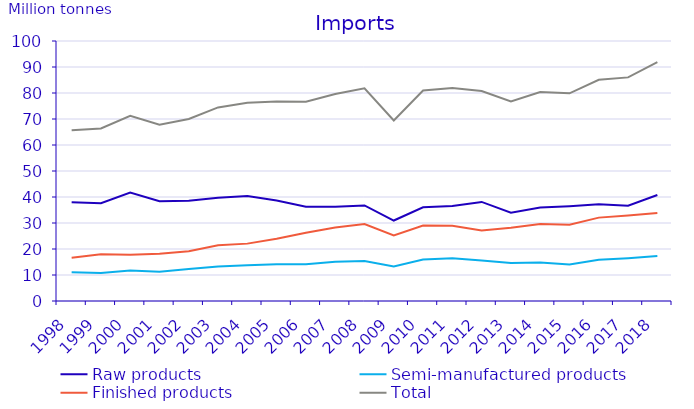
| Category | Raw products | Semi-manufactured products | Finished products | Total |
|---|---|---|---|---|
| 1998.0 | 37.966 | 11.014 | 16.661 | 65.641 |
| 1999.0 | 37.636 | 10.727 | 17.985 | 66.347 |
| 2000.0 | 41.688 | 11.758 | 17.752 | 71.198 |
| 2001.0 | 38.371 | 11.277 | 18.182 | 67.83 |
| 2002.0 | 38.577 | 12.277 | 19.143 | 69.998 |
| 2003.0 | 39.734 | 13.273 | 21.444 | 74.451 |
| 2004.0 | 40.405 | 13.753 | 22.066 | 76.225 |
| 2005.0 | 38.684 | 14.132 | 23.906 | 76.722 |
| 2006.0 | 36.256 | 14.162 | 26.212 | 76.629 |
| 2007.0 | 36.27 | 15.078 | 28.265 | 79.613 |
| 2008.0 | 36.749 | 15.423 | 29.631 | 81.803 |
| 2009.0 | 30.949 | 13.254 | 25.211 | 69.414 |
| 2010.0 | 36.017 | 15.931 | 29.011 | 80.96 |
| 2011.0 | 36.516 | 16.464 | 28.968 | 81.948 |
| 2012.0 | 38.104 | 15.532 | 27.102 | 80.737 |
| 2013.0 | 33.918 | 14.615 | 28.185 | 76.719 |
| 2014.0 | 35.964 | 14.786 | 29.615 | 80.364 |
| 2015.0 | 36.447 | 14.052 | 29.373 | 79.871 |
| 2016.0 | 37.172 | 15.832 | 32.07 | 85.074 |
| 2017.0 | 36.644 | 16.467 | 32.893 | 86.004 |
| 2018.0 | 40.748 | 17.287 | 33.845 | 91.88 |